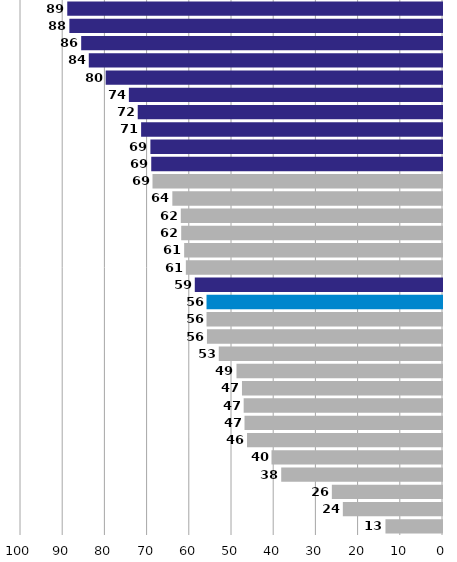
| Category | Series 1 |
|---|---|
| CHL | 13.4 |
| TUR | 23.5 |
| MEX | 26.1 |
| PRT | 38.1 |
| GRC | 40.4 |
| KOR | 46.2 |
| HUN | 46.8 |
| SVK | 47 |
| POL | 47.4 |
| USA | 48.7 |
| SLO | 52.9 |
| CZE | 55.7 |
| IRE | 55.8 |
| FRA | 55.8 |
| OECD | 58.58 |
| JPN | 60.7 |
| DEU | 61.1 |
| AUT | 61.8 |
| ESP | 61.9 |
| AUS | 63.9 |
| BEL | 68.6 |
| GBR | 68.9 |
| NZL | 69.1 |
| ISR | 71.3 |
| EST | 72.1 |
| CHE | 74.2 |
| NLD | 79.7 |
| SWE | 83.7 |
| FIN | 85.5 |
| NOR | 88.3 |
| DEN | 88.8 |